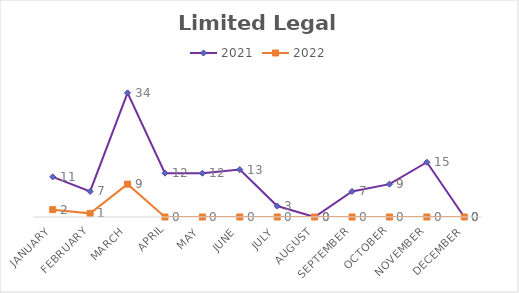
| Category | 2021 | 2022 |
|---|---|---|
| January | 11 | 2 |
| February | 7 | 1 |
| March | 34 | 9 |
| April | 12 | 0 |
| May | 12 | 0 |
| June | 13 | 0 |
| July | 3 | 0 |
| August | 0 | 0 |
| September | 7 | 0 |
| October | 9 | 0 |
| November | 15 | 0 |
| December | 0 | 0 |